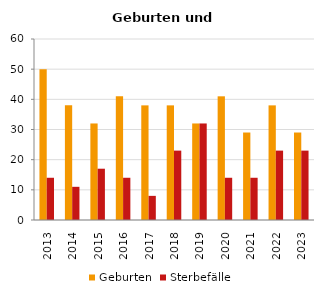
| Category | Geburten | Sterbefälle |
|---|---|---|
| 2013.0 | 50 | 14 |
| 2014.0 | 38 | 11 |
| 2015.0 | 32 | 17 |
| 2016.0 | 41 | 14 |
| 2017.0 | 38 | 8 |
| 2018.0 | 38 | 23 |
| 2019.0 | 32 | 32 |
| 2020.0 | 41 | 14 |
| 2021.0 | 29 | 14 |
| 2022.0 | 38 | 23 |
| 2023.0 | 29 | 23 |